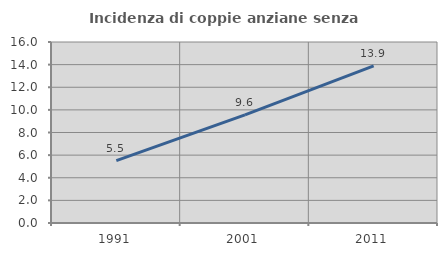
| Category | Incidenza di coppie anziane senza figli  |
|---|---|
| 1991.0 | 5.512 |
| 2001.0 | 9.555 |
| 2011.0 | 13.894 |